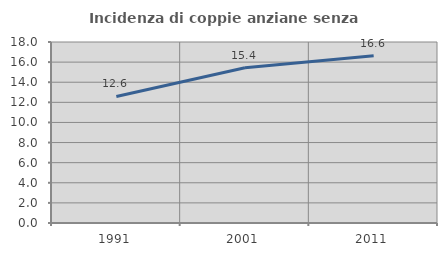
| Category | Incidenza di coppie anziane senza figli  |
|---|---|
| 1991.0 | 12.587 |
| 2001.0 | 15.445 |
| 2011.0 | 16.627 |